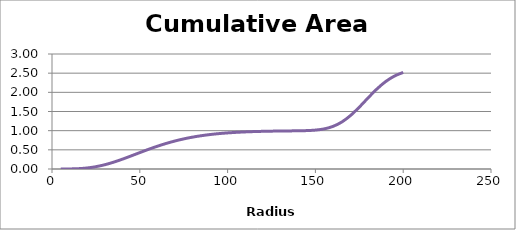
| Category | Series 3 |
|---|---|
| 5.0 | 0 |
| 10.0 | 0.002 |
| 15.0 | 0.009 |
| 20.0 | 0.027 |
| 25.0 | 0.06 |
| 30.0 | 0.111 |
| 35.0 | 0.177 |
| 40.0 | 0.255 |
| 45.0 | 0.34 |
| 50.0 | 0.428 |
| 55.0 | 0.514 |
| 60.0 | 0.594 |
| 65.0 | 0.667 |
| 70.0 | 0.73 |
| 75.0 | 0.785 |
| 80.0 | 0.831 |
| 85.0 | 0.869 |
| 90.0 | 0.899 |
| 95.0 | 0.923 |
| 100.0 | 0.942 |
| 105.0 | 0.957 |
| 110.0 | 0.968 |
| 115.0 | 0.976 |
| 120.0 | 0.983 |
| 125.0 | 0.987 |
| 130.0 | 0.991 |
| 135.0 | 0.994 |
| 140.0 | 0.997 |
| 145.0 | 1.002 |
| 150.0 | 1.015 |
| 155.0 | 1.046 |
| 160.0 | 1.111 |
| 165.0 | 1.225 |
| 170.0 | 1.396 |
| 175.0 | 1.614 |
| 180.0 | 1.855 |
| 185.0 | 2.086 |
| 190.0 | 2.28 |
| 195.0 | 2.425 |
| 200.0 | 2.52 |